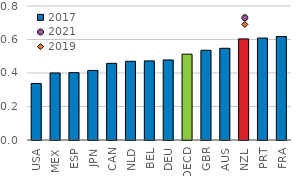
| Category | 2017 |
|---|---|
| USA | 0.337 |
| MEX | 0.4 |
| ESP | 0.402 |
| JPN | 0.415 |
| CAN | 0.458 |
| NLD | 0.47 |
| BEL | 0.472 |
| DEU | 0.478 |
| OECD | 0.512 |
| GBR | 0.536 |
| AUS | 0.547 |
| NZL | 0.604 |
| PRT | 0.609 |
| FRA | 0.618 |